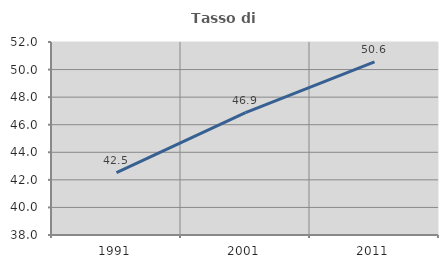
| Category | Tasso di occupazione   |
|---|---|
| 1991.0 | 42.53 |
| 2001.0 | 46.87 |
| 2011.0 | 50.552 |